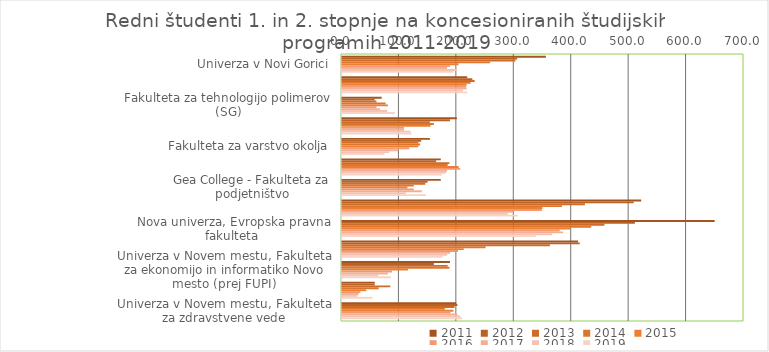
| Category | 2011 | 2012 | 2013 | 2014 | 2015 | 2016 | 2017 | 2018 | 2019 |
|---|---|---|---|---|---|---|---|---|---|
| Univerza v Novi Gorici | 355 | 305 | 302 | 258 | 203 | 188 | 183 | 200 | 194 |
| Fakulteta za dizajn, samostojni visokošolski zavod | 218 | 227 | 231 | 224 | 217 | 216 | 217 | 210 | 218 |
| Fakulteta za tehnologijo polimerov (SG) | 69 | 57 | 60 | 76 | 80 | 60 | 66 | 79 | 92 |
| Fakulteta za uporabne družbene študije v Novi Gorici | 200 | 188 | 153 | 160 | 154 | 108 | 108 | 119 | 121 |
| Fakulteta za varstvo okolja | 153 | 138 | 133 | 136 | 133 | 117 | 98 | 82 | 74 |
| Fakulteta za zdravstvo Angele Boškin (Jesenice) | 172 | 164 | 187 | 184 | 203 | 206 | 183 | 181 | 174 |
| Gea College - Fakulteta za podjetništvo | 172 | 149 | 145 | 125 | 114 | 125 | 139 | 111 | 146 |
| Mednarodna fakulteta za družbene in poslovne študije | 521 | 508 | 423 | 383 | 349 | 348 | 298 | 289 | 306 |
| Nova univerza, Evropska pravna fakulteta  | 649 | 510 | 457 | 434 | 398 | 379 | 385 | 366 | 338 |
| Nova univerza, Fakulteta za državne in evropske študije | 411 | 414 | 362 | 250 | 212 | 202 | 188 | 183 | 175 |
| Univerza v Novem mestu, Fakulteta za ekonomijo in informatiko Novo mesto (prej FUPI) | 188 | 160 | 184 | 187 | 115 | 87 | 80 | 63 | 85 |
| Univerza v Novem mestu, Fakulteta za strojništvo (prej FTS) | 57 | 57 | 84 | 64 | 42 | 32 | 29 | 27 | 53 |
| Univerza v Novem mestu, Fakulteta za zdravstvene vede | 199 | 201 | 196 | 179 | 194 | 189 | 201 | 206 | 209 |